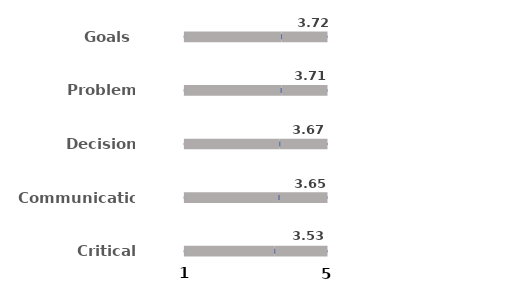
| Category | Min | Diff 1 | Diff 2 | CYFAR |
|---|---|---|---|---|
| Critical Thinking | 1 | 2.53 | 1.47 | 3.53 |
| Communication | 1 | 2.65 | 1.35 | 3.65 |
| Decision Making | 1 | 2.67 | 1.33 | 3.67 |
| Problem Solving | 1 | 2.71 | 1.29 | 3.71 |
| Goals | 1 | 2.72 | 1.28 | 3.72 |